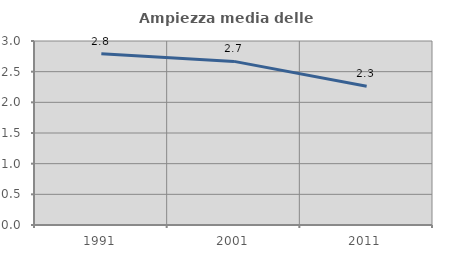
| Category | Ampiezza media delle famiglie |
|---|---|
| 1991.0 | 2.791 |
| 2001.0 | 2.668 |
| 2011.0 | 2.264 |